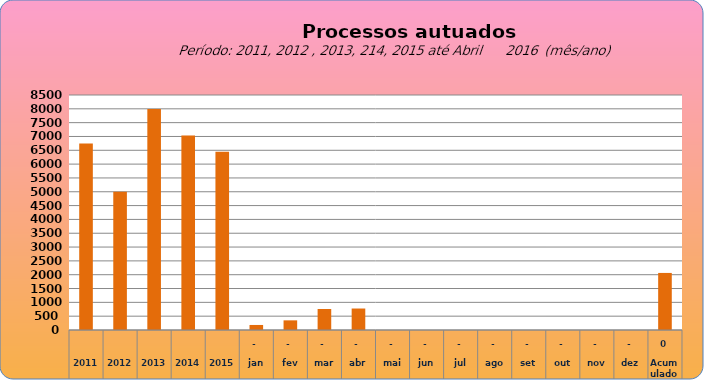
| Category | 6749 |
|---|---|
| 2011 | 6749 |
| 2012 | 4997 |
| 2013 | 7990 |
| 2014 | 7034 |
| 2015 | 6446 |
| jan | 182 |
| fev | 349 |
| mar | 760 |
| abr | 777 |
| mai | 0 |
| jun | 0 |
| jul | 0 |
| ago | 0 |
| set | 0 |
| out | 0 |
| nov | 0 |
| dez | 0 |
| Acumulado
 | 2064 |